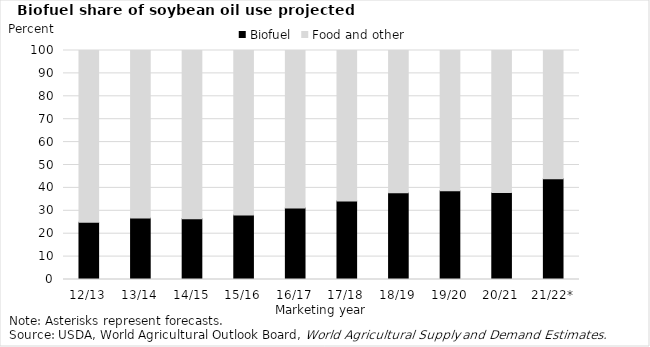
| Category | Biofuel | Food and other |
|---|---|---|
| 12/13 | 24.959 | 75.041 |
| 13/14 | 26.856 | 73.144 |
| 14/15 | 26.577 | 73.423 |
| 15/16 | 28.122 | 71.878 |
| 16/17 | 31.216 | 68.784 |
| 17/18 | 34.301 | 65.699 |
| 18/19 | 37.874 | 62.126 |
| 19/20 | 38.795 | 61.205 |
| 20/21 | 38.02 | 61.98 |
| 21/22* | 44 | 56 |